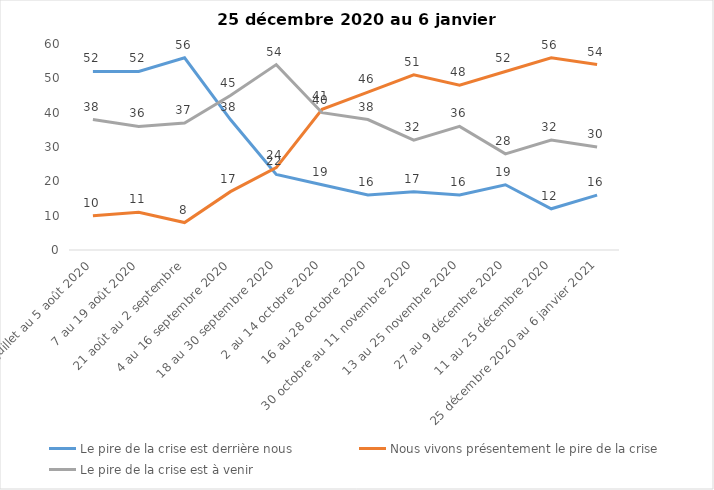
| Category | Le pire de la crise est derrière nous | Nous vivons présentement le pire de la crise | Le pire de la crise est à venir |
|---|---|---|---|
| 24 juillet au 5 août 2020 | 52 | 10 | 38 |
| 7 au 19 août 2020 | 52 | 11 | 36 |
| 21 août au 2 septembre | 56 | 8 | 37 |
| 4 au 16 septembre 2020 | 38 | 17 | 45 |
| 18 au 30 septembre 2020 | 22 | 24 | 54 |
| 2 au 14 octobre 2020 | 19 | 41 | 40 |
| 16 au 28 octobre 2020 | 16 | 46 | 38 |
| 30 octobre au 11 novembre 2020 | 17 | 51 | 32 |
| 13 au 25 novembre 2020 | 16 | 48 | 36 |
| 27 au 9 décembre 2020 | 19 | 52 | 28 |
| 11 au 25 décembre 2020 | 12 | 56 | 32 |
| 25 décembre 2020 au 6 janvier 2021 | 16 | 54 | 30 |